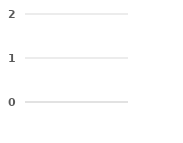
| Category | Series 0 | Series 1 | Series 2 |
|---|---|---|---|
|  | 0 | 0 | 0 |
|  | 0 | 0 | 0 |